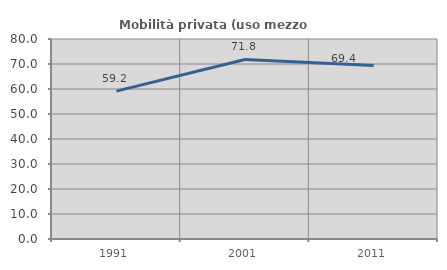
| Category | Mobilità privata (uso mezzo privato) |
|---|---|
| 1991.0 | 59.167 |
| 2001.0 | 71.823 |
| 2011.0 | 69.431 |